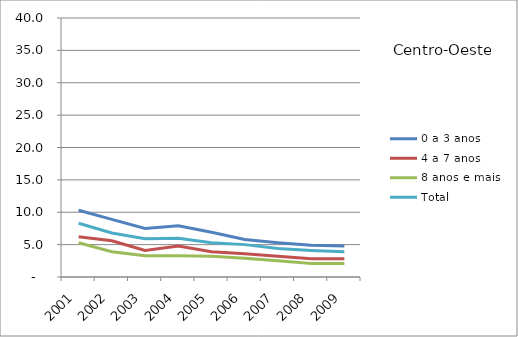
| Category | 0 a 3 anos | 4 a 7 anos | 8 anos e mais | Total |
|---|---|---|---|---|
| 2001.0 | 10.3 | 6.2 | 5.3 | 8.3 |
| 2002.0 | 8.9 | 5.6 | 3.9 | 6.8 |
| 2003.0 | 7.5 | 4.1 | 3.3 | 5.9 |
| 2004.0 | 7.9 | 4.8 | 3.3 | 6 |
| 2005.0 | 6.9 | 3.9 | 3.2 | 5.3 |
| 2006.0 | 5.8 | 3.6 | 2.9 | 5 |
| 2007.0 | 5.3 | 3.2 | 2.5 | 4.4 |
| 2008.0 | 4.9 | 2.8 | 2.1 | 4.1 |
| 2009.0 | 4.8 | 2.8 | 2.1 | 3.9 |